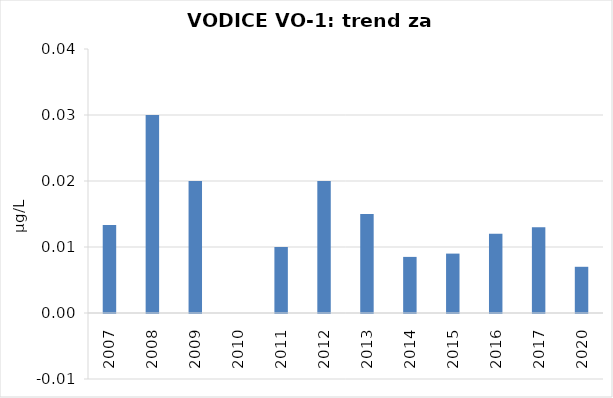
| Category | Vsota |
|---|---|
| 2007 | 0.013 |
| 2008 | 0.03 |
| 2009 | 0.02 |
| 2010 | 0 |
| 2011 | 0.01 |
| 2012 | 0.02 |
| 2013 | 0.015 |
| 2014 | 0.008 |
| 2015 | 0.009 |
| 2016 | 0.012 |
| 2017 | 0.013 |
| 2020 | 0.007 |